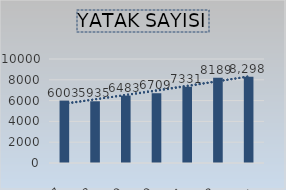
| Category | Series 6 |
|---|---|
| 2017 | 6003 |
| 2018 | 5935 |
| 2019 | 6483 |
| 2020 | 6709 |
| 2021 | 7331 |
| 2022 | 8189 |
| 2023(Kasım Ayı İtibariyle) | 8298 |